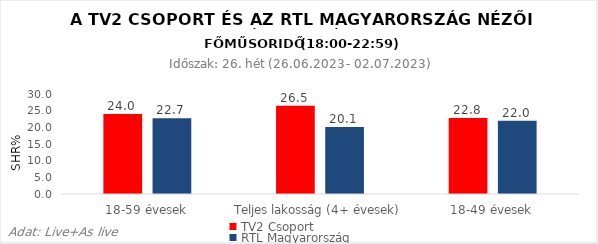
| Category | TV2 Csoport | RTL Magyarország |
|---|---|---|
| 18-59 évesek | 24 | 22.7 |
| Teljes lakosság (4+ évesek) | 26.5 | 20.1 |
| 18-49 évesek | 22.8 | 22 |